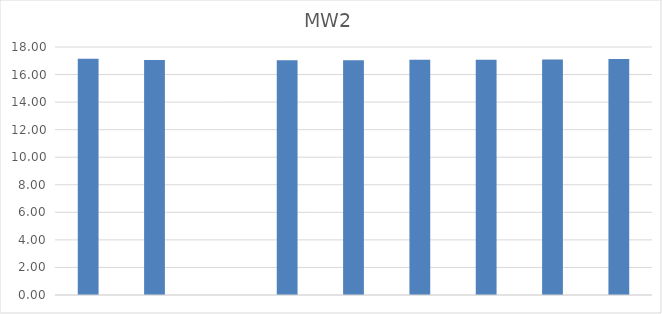
| Category | MW2 |
|---|---|
|  | 17.14 |
|  | 17.06 |
|  | 0 |
|  | 17.04 |
|  | 17.04 |
|  | 17.08 |
|  | 17.08 |
|  | 17.1 |
|  | 17.13 |